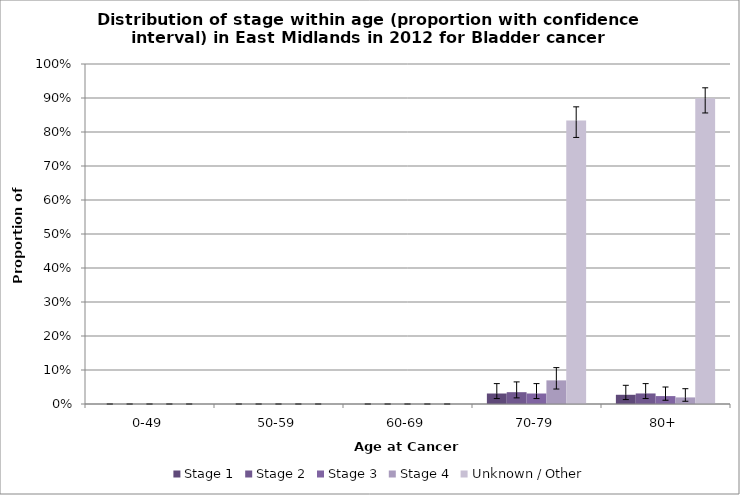
| Category | Stage 1 | Stage 2 | Stage 3 | Stage 4 | Unknown / Other |
|---|---|---|---|---|---|
| 0-49 | 0 | 0 | 0 | 0 | 0 |
| 50-59 | 0 | 0 | 0 | 0 | 0 |
| 60-69 | 0 | 0 | 0 | 0 | 0 |
| 70-79 | 0.031 | 0.035 | 0.031 | 0.069 | 0.834 |
| 80+ | 0.027 | 0.031 | 0.023 | 0.019 | 0.899 |